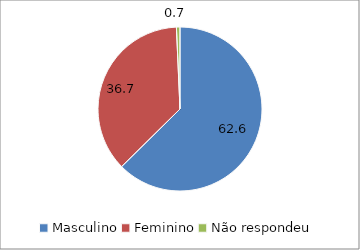
| Category | Series 0 |
|---|---|
| Masculino | 62.6 |
| Feminino | 36.7 |
| Não respondeu | 0.7 |